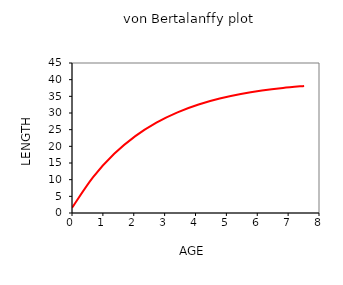
| Category | Length plot |
|---|---|
| 0.0 | 1.568 |
| 0.6834327689973331 | 10.761 |
| 1.3668655379946661 | 17.755 |
| 2.050298306991999 | 23.076 |
| 2.7337310759893323 | 27.124 |
| 3.4171638449866655 | 30.204 |
| 4.100596613983998 | 32.547 |
| 4.784029382981331 | 34.33 |
| 5.467462151978665 | 35.686 |
| 6.150894920975998 | 36.718 |
| 6.834327689973331 | 37.503 |
| 7.517760458970663 | 38.1 |